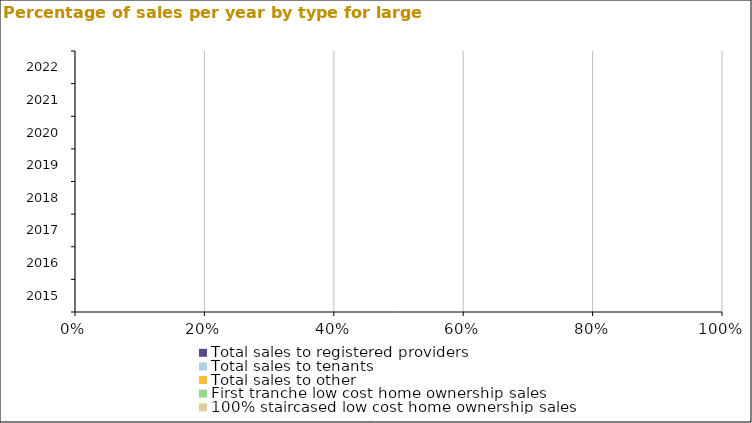
| Category | Total sales to registered providers | Total sales to tenants | Total sales to other | First tranche low cost home ownership sales | 100% staircased low cost home ownership sales |
|---|---|---|---|---|---|
| 2015.0 | 0 | 0 | 0 | 0 | 0 |
| 2016.0 | 0 | 0 | 0 | 0 | 0 |
| 2017.0 | 0 | 0 | 0 | 0 | 0 |
| 2018.0 | 0 | 0 | 0 | 0 | 0 |
| 2019.0 | 0 | 0 | 0 | 0 | 0 |
| 2020.0 | 0 | 0 | 0 | 0 | 0 |
| 2021.0 | 0 | 0 | 0 | 0 | 0 |
| 2022.0 | 0 | 0 | 0 | 0 | 0 |